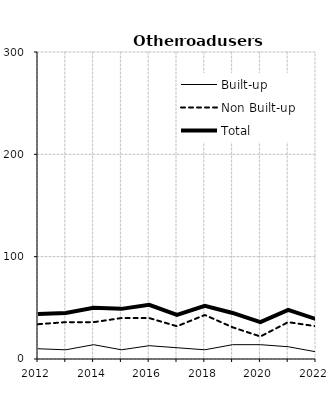
| Category | Built-up | Non Built-up | Total |
|---|---|---|---|
| 2012.0 | 10 | 34 | 44 |
| 2013.0 | 9 | 36 | 45 |
| 2014.0 | 14 | 36 | 50 |
| 2015.0 | 9 | 40 | 49 |
| 2016.0 | 13 | 40 | 53 |
| 2017.0 | 11 | 32 | 43 |
| 2018.0 | 9 | 43 | 52 |
| 2019.0 | 14 | 31 | 45 |
| 2020.0 | 14 | 22 | 36 |
| 2021.0 | 12 | 36 | 48 |
| 2022.0 | 7 | 32 | 39 |